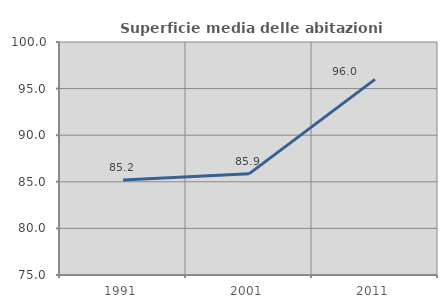
| Category | Superficie media delle abitazioni occupate |
|---|---|
| 1991.0 | 85.185 |
| 2001.0 | 85.851 |
| 2011.0 | 95.992 |